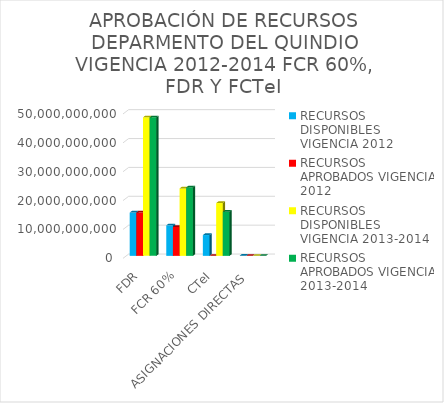
| Category | RECURSOS DISPONIBLES VIGENCIA 2012  | RECURSOS APROBADOS VIGENCIA 2012 | RECURSOS DISPONIBLES VIGENCIA 2013-2014 | RECURSOS APROBADOS VIGENCIA 2013-2014 |
|---|---|---|---|---|
| FDR | 15002814726.332 | 15002814726.332 | 47961789887.354 | 47961789887 |
| FCR 60% | 10564981702 | 10000000000 | 23339221563.051 | 23699221563 |
| CTeI | 7203086182.825 | 0 | 18282421543.126 | 15283020000 |
| ASIGNACIONES DIRECTAS  | 11208437 | 0 | 4458903.262 | 4458903 |